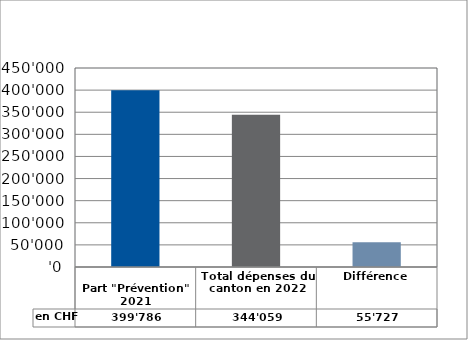
| Category | en CHF |
|---|---|
| 
Part "Prévention" 2021

 | 399786 |
| Total dépenses du canton en 2022 | 344058.55 |
| Différence | 55727.45 |